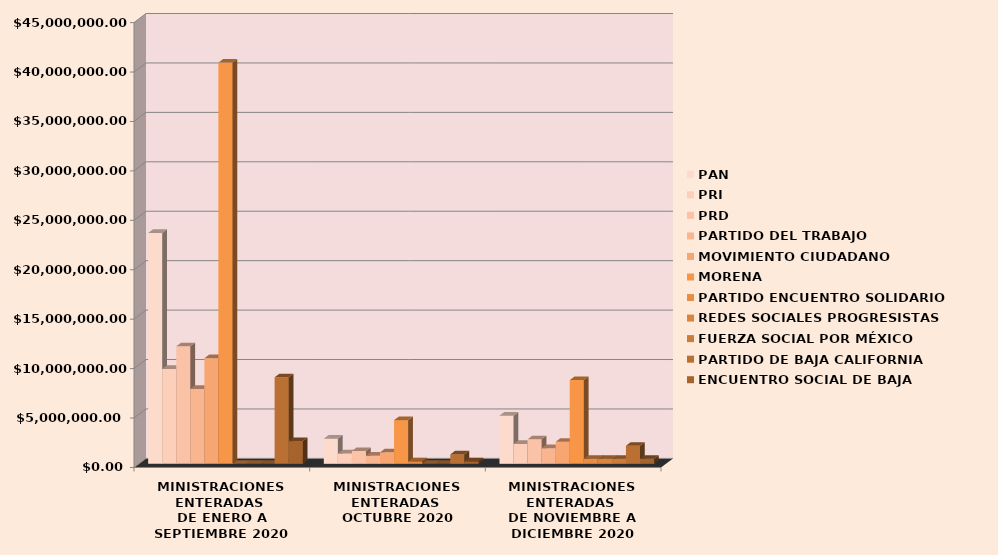
| Category | PAN | PRI | PRD | PARTIDO DEL TRABAJO | MOVIMIENTO CIUDADANO | MORENA | PARTIDO ENCUENTRO SOLIDARIO | REDES SOCIALES PROGRESISTAS | FUERZA SOCIAL POR MÉXICO | PARTIDO DE BAJA CALIFORNIA | ENCUENTRO SOCIAL DE BAJA CALIFORNIA |
|---|---|---|---|---|---|---|---|---|---|---|---|
| MINISTRACIONES ENTERADAS 
DE ENERO A SEPTIEMBRE 2020 | 23352969.37 | 9604107.12 | 11882595.64 | 7580207.72 | 10682224.79 | 40583841.84 | 0 | 0 | 0 | 8750225.33 | 2294615.75 |
| MINISTRACIONES ENTERADAS 
OCTUBRE 2020 | 2541819.79 | 1045344.99 | 1293343.74 | 825056.62 | 1162691.13 | 4417288.91 | 254957.31 | 0 | 0 | 952405.48 | 254957.31 |
| MINISTRACIONES ENTERADAS 
DE NOVIEMBRE A DICIEMBRE 2020 | 4871821.27 | 2003577.9 | 2478908.84 | 1581358.52 | 2228491.34 | 8466470.4 | 509914.61 | 509914.61 | 509914.61 | 1825443.83 | 509914.61 |